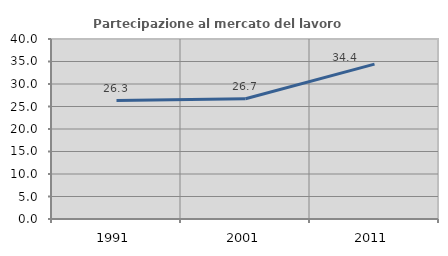
| Category | Partecipazione al mercato del lavoro  femminile |
|---|---|
| 1991.0 | 26.307 |
| 2001.0 | 26.726 |
| 2011.0 | 34.425 |